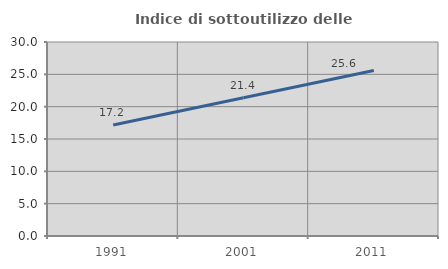
| Category | Indice di sottoutilizzo delle abitazioni  |
|---|---|
| 1991.0 | 17.16 |
| 2001.0 | 21.365 |
| 2011.0 | 25.6 |